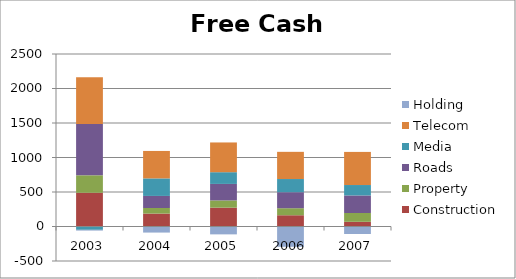
| Category | Construction | Property | Roads | Media | Telecom | Holding |
|---|---|---|---|---|---|---|
| 2003.0 | 489 | 253 | 742 | -48 | 680 | -11 |
| 2004.0 | 187 | 81 | 175 | 254 | 398 | -88 |
| 2005.0 | 273 | 105 | 239 | 170 | 431 | -114 |
| 2006.0 | 163 | 102 | 232 | 191 | 394 | -294 |
| 2007.0 | 68 | 128 | 254 | 151 | 480 | -109 |